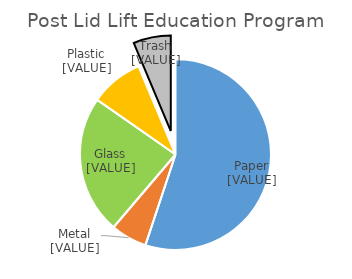
| Category | Series 0 |
|---|---|
| Paper | 0.551 |
| Metal | 0.061 |
| Glass | 0.235 |
| Plastic | 0.09 |
| Trash  | 0.063 |